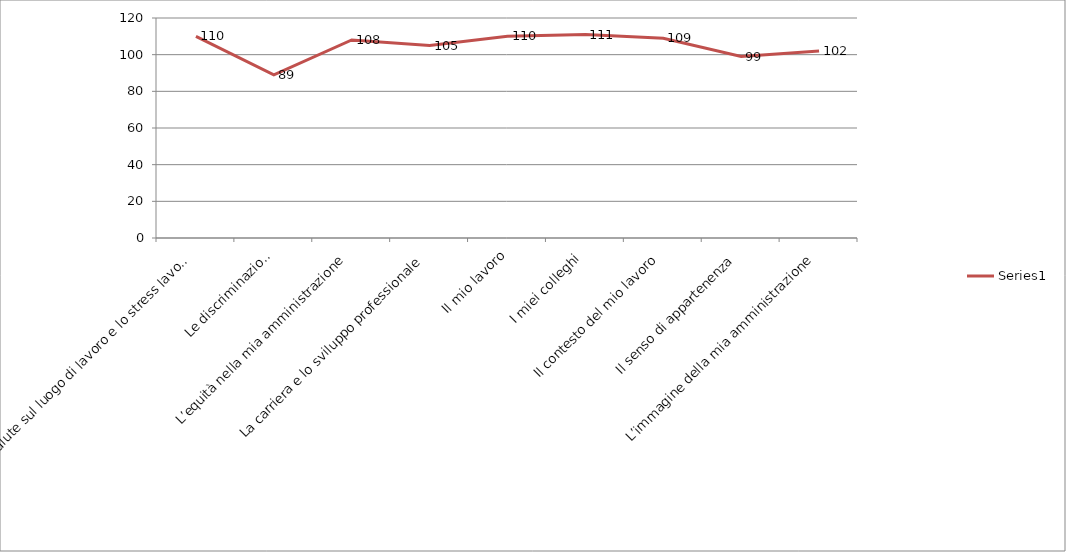
| Category | Series 0 |
|---|---|
| La sicurezza e la salute sul luogo di lavoro e lo stress lavoro correlato  | 110 |
| Le discriminazioni | 89 |
| L’equità nella mia amministrazione | 108 |
| La carriera e lo sviluppo professionale | 105 |
| Il mio lavoro | 110 |
| I miei colleghi | 111 |
| Il contesto del mio lavoro | 109 |
| Il senso di appartenenza | 99 |
| L’immagine della mia amministrazione | 102 |